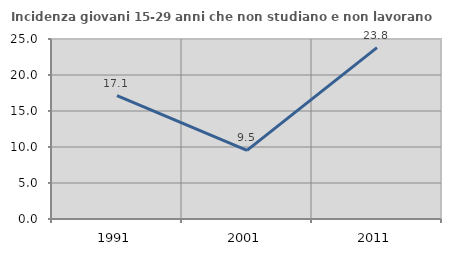
| Category | Incidenza giovani 15-29 anni che non studiano e non lavorano  |
|---|---|
| 1991.0 | 17.131 |
| 2001.0 | 9.524 |
| 2011.0 | 23.81 |